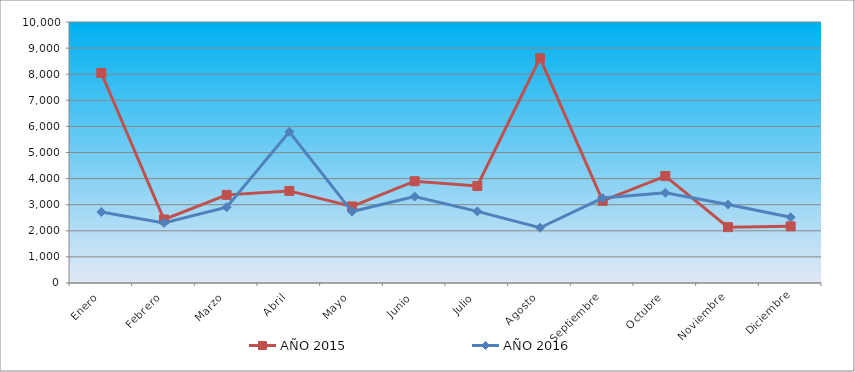
| Category | AÑO 2015 | AÑO 2016 |
|---|---|---|
| Enero | 8044.738 | 2718.687 |
| Febrero | 2433.546 | 2300.33 |
| Marzo | 3376.74 | 2903.411 |
| Abril | 3529.162 | 5792.629 |
| Mayo | 2933.803 | 2736.82 |
| Junio | 3900.447 | 3312.149 |
| Julio | 3715.456 | 2744.783 |
| Agosto | 8614.208 | 2116.729 |
| Septiembre | 3147.455 | 3253.352 |
| Octubre | 4095.861 | 3456.713 |
| Noviembre | 2140.426 | 3005.011 |
| Diciembre | 2170.389 | 2516.977 |